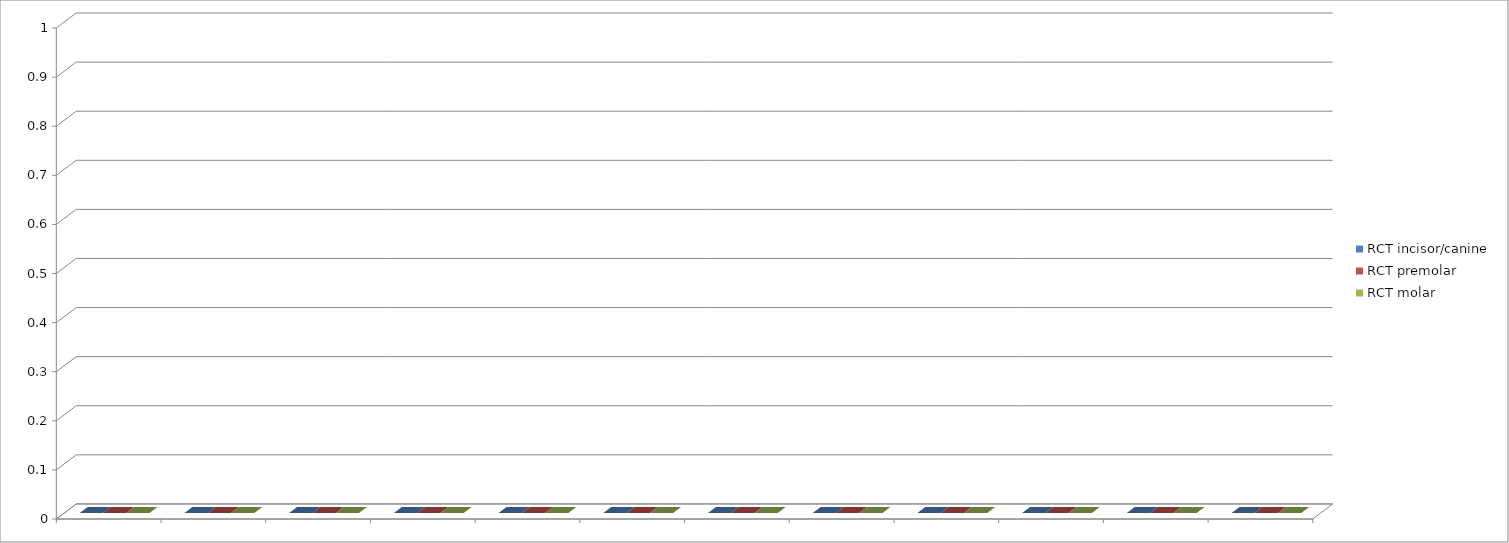
| Category | RCT incisor/canine | RCT premolar | RCT molar |
|---|---|---|---|
| 0 | 0 | 0 | 0 |
| 1 | 0 | 0 | 0 |
| 2 | 0 | 0 | 0 |
| 3 | 0 | 0 | 0 |
| 4 | 0 | 0 | 0 |
| 5 | 0 | 0 | 0 |
| 6 | 0 | 0 | 0 |
| 7 | 0 | 0 | 0 |
| 8 | 0 | 0 | 0 |
| 9 | 0 | 0 | 0 |
| 10 | 0 | 0 | 0 |
| 11 | 0 | 0 | 0 |